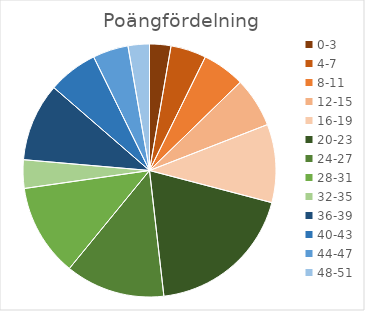
| Category | Series 0 |
|---|---|
| 0-3 | 3 |
| 4-7 | 5 |
| 8-11 | 6 |
| 12-15 | 7 |
| 16-19 | 11 |
| 20-23 | 21 |
| 24-27 | 14 |
| 28-31 | 13 |
| 32-35 | 4 |
| 36-39 | 11 |
| 40-43 | 7 |
| 44-47 | 5 |
| 48-51 | 3 |